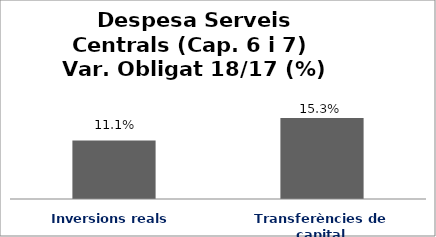
| Category | Series 0 |
|---|---|
| Inversions reals | 0.111 |
| Transferències de capital | 0.153 |